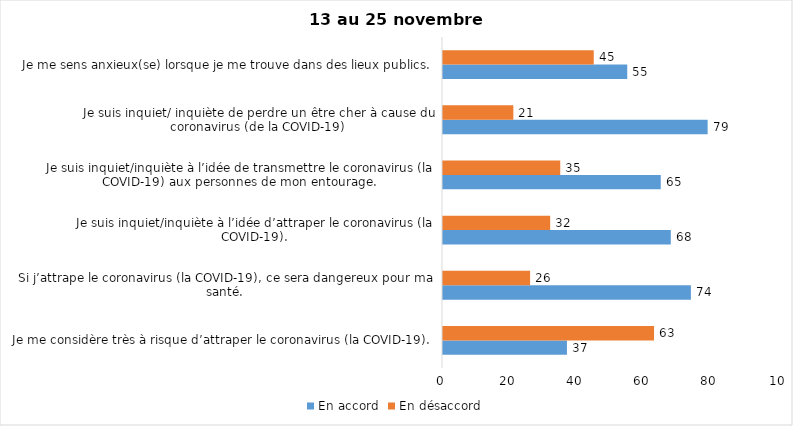
| Category | En accord | En désaccord |
|---|---|---|
| Je me considère très à risque d’attraper le coronavirus (la COVID-19). | 37 | 63 |
| Si j’attrape le coronavirus (la COVID-19), ce sera dangereux pour ma santé. | 74 | 26 |
| Je suis inquiet/inquiète à l’idée d’attraper le coronavirus (la COVID-19). | 68 | 32 |
| Je suis inquiet/inquiète à l’idée de transmettre le coronavirus (la COVID-19) aux personnes de mon entourage. | 65 | 35 |
| Je suis inquiet/ inquiète de perdre un être cher à cause du coronavirus (de la COVID-19) | 79 | 21 |
| Je me sens anxieux(se) lorsque je me trouve dans des lieux publics. | 55 | 45 |